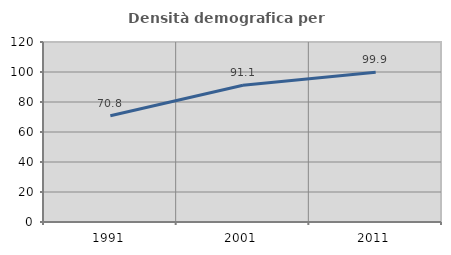
| Category | Densità demografica |
|---|---|
| 1991.0 | 70.778 |
| 2001.0 | 91.13 |
| 2011.0 | 99.871 |